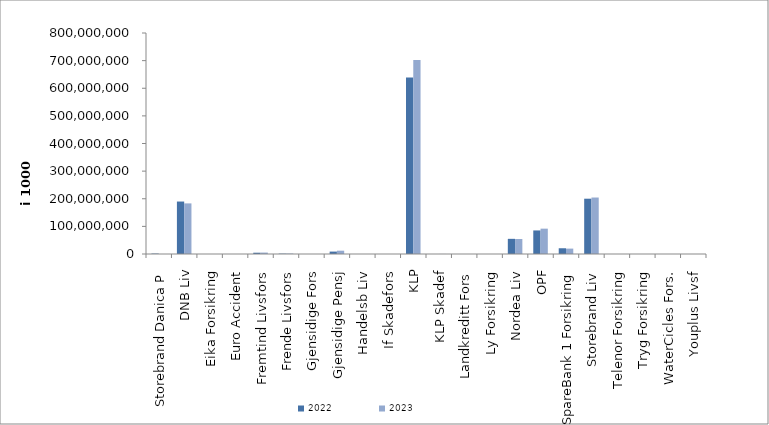
| Category | 2022 | 2023 |
|---|---|---|
| Storebrand Danica P | 1511060.234 | 0 |
| DNB Liv | 189898877.812 | 183219364 |
| Eika Forsikring | 0 | 0 |
| Euro Accident | 0 | 0 |
| Fremtind Livsfors | 4663711.953 | 5178287.974 |
| Frende Livsfors | 1264435 | 1615536 |
| Gjensidige Fors | 0 | 0 |
| Gjensidige Pensj | 8716977 | 11976354 |
| Handelsb Liv | 1519.595 | 0 |
| If Skadefors | 0 | 0 |
| KLP | 639219292.353 | 701899868.415 |
| KLP Skadef | 99044.308 | 127284.87 |
| Landkreditt Fors | 0 | 0 |
| Ly Forsikring | 0 | 0 |
| Nordea Liv | 54880190 | 54295670 |
| OPF | 85289000 | 91739000 |
| SpareBank 1 Forsikring | 20801168.006 | 19517824.671 |
| Storebrand Liv | 200165633.337 | 204439320.964 |
| Telenor Forsikring | 0 | 0 |
| Tryg Forsikring | 0 | 0 |
| WaterCicles Fors. | 0 | 0 |
| Youplus Livsf | 3017 | 13865 |